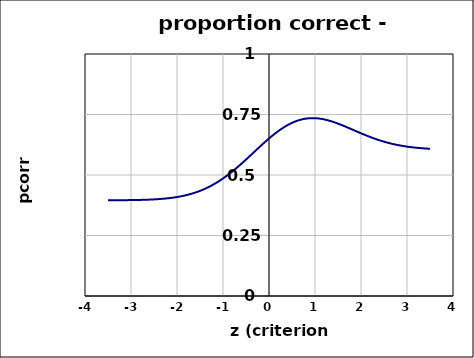
| Category | Series 0 |
|---|---|
| -3.5 | 0.396 |
| -3.4 | 0.396 |
| -3.3 | 0.396 |
| -3.1999999999999997 | 0.396 |
| -3.0999999999999996 | 0.396 |
| -2.9999999999999996 | 0.396 |
| -2.8999999999999995 | 0.397 |
| -2.7999999999999994 | 0.397 |
| -2.6999999999999993 | 0.398 |
| -2.599999999999999 | 0.398 |
| -2.499999999999999 | 0.399 |
| -2.399999999999999 | 0.4 |
| -2.299999999999999 | 0.402 |
| -2.199999999999999 | 0.404 |
| -2.0999999999999988 | 0.406 |
| -1.9999999999999987 | 0.409 |
| -1.8999999999999986 | 0.412 |
| -1.7999999999999985 | 0.417 |
| -1.6999999999999984 | 0.422 |
| -1.5999999999999983 | 0.428 |
| -1.4999999999999982 | 0.434 |
| -1.3999999999999981 | 0.442 |
| -1.299999999999998 | 0.451 |
| -1.199999999999998 | 0.462 |
| -1.0999999999999979 | 0.473 |
| -0.9999999999999979 | 0.486 |
| -0.8999999999999979 | 0.499 |
| -0.7999999999999979 | 0.514 |
| -0.699999999999998 | 0.53 |
| -0.599999999999998 | 0.546 |
| -0.499999999999998 | 0.564 |
| -0.399999999999998 | 0.581 |
| -0.29999999999999805 | 0.599 |
| -0.19999999999999804 | 0.617 |
| -0.09999999999999803 | 0.634 |
| 1.970645868709653e-15 | 0.651 |
| 0.10000000000000198 | 0.667 |
| 0.20000000000000198 | 0.681 |
| 0.300000000000002 | 0.694 |
| 0.400000000000002 | 0.706 |
| 0.500000000000002 | 0.715 |
| 0.600000000000002 | 0.723 |
| 0.700000000000002 | 0.729 |
| 0.8000000000000019 | 0.733 |
| 0.9000000000000019 | 0.735 |
| 1.000000000000002 | 0.735 |
| 1.100000000000002 | 0.733 |
| 1.2000000000000022 | 0.73 |
| 1.3000000000000023 | 0.725 |
| 1.4000000000000024 | 0.719 |
| 1.5000000000000024 | 0.712 |
| 1.6000000000000025 | 0.705 |
| 1.7000000000000026 | 0.697 |
| 1.8000000000000027 | 0.689 |
| 1.9000000000000028 | 0.681 |
| 2.0000000000000027 | 0.672 |
| 2.1000000000000028 | 0.665 |
| 2.200000000000003 | 0.657 |
| 2.300000000000003 | 0.65 |
| 2.400000000000003 | 0.644 |
| 2.500000000000003 | 0.638 |
| 2.600000000000003 | 0.632 |
| 2.7000000000000033 | 0.628 |
| 2.8000000000000034 | 0.624 |
| 2.9000000000000035 | 0.62 |
| 3.0000000000000036 | 0.617 |
| 3.1000000000000036 | 0.615 |
| 3.2000000000000037 | 0.613 |
| 3.300000000000004 | 0.611 |
| 3.400000000000004 | 0.61 |
| 3.500000000000004 | 0.608 |